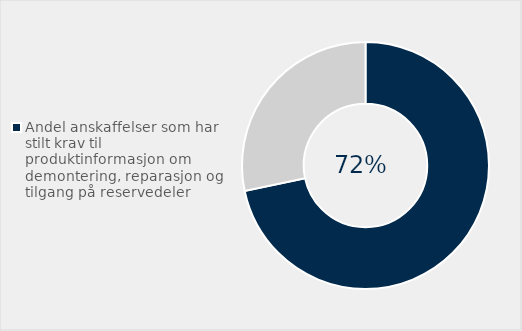
| Category | Series 0 |
|---|---|
| Andel anskaffelser som har stilt krav til produktinformasjon om demontering, reparasjon og tilgang på reservedeler | 0.717 |
| Ikke stilt krav | 0.283 |